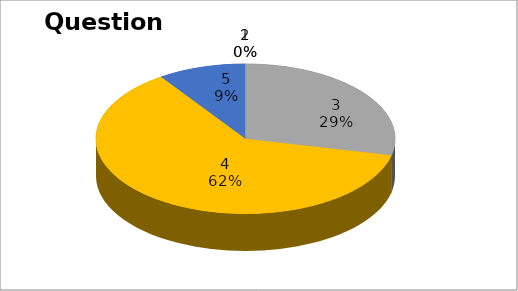
| Category | Series 0 |
|---|---|
| 0 | 0 |
| 1 | 0 |
| 2 | 6 |
| 3 | 13 |
| 4 | 2 |